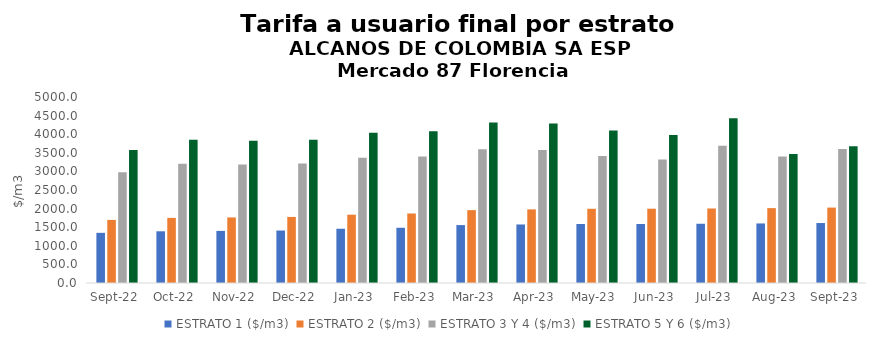
| Category | ESTRATO 1 ($/m3) | ESTRATO 2 ($/m3) | ESTRATO 3 Y 4 ($/m3) | ESTRATO 5 Y 6 ($/m3) |
|---|---|---|---|---|
| 2022-09-01 | 1348.44 | 1696.41 | 2979.32 | 3575.184 |
| 2022-10-01 | 1390.28 | 1750.02 | 3208.12 | 3849.744 |
| 2022-11-01 | 1400.42 | 1762.52 | 3185.9 | 3823.08 |
| 2022-12-01 | 1410.99 | 1776 | 3209.93 | 3851.916 |
| 2023-01-01 | 1458.78 | 1836 | 3365.49 | 4038.588 |
| 2023-02-01 | 1484.64 | 1868.8 | 3398.26 | 4077.912 |
| 2023-03-01 | 1556.75 | 1959.18 | 3596.1 | 4315.32 |
| 2023-04-01 | 1573.28 | 1979.65 | 3575.22 | 4290.264 |
| 2023-05-01 | 1585.35 | 1995.07 | 3416.65 | 4099.98 |
| 2023-06-01 | 1586.86 | 1997.09 | 3316.57 | 3979.884 |
| 2023-07-01 | 1592.9 | 2003.01 | 3689.81 | 4427.772 |
| 2023-08-01 | 1600.9 | 2012.86 | 3401.48 | 3469.51 |
| 2023-09-01 | 1612.14 | 2027.25 | 3603.59 | 3675.662 |